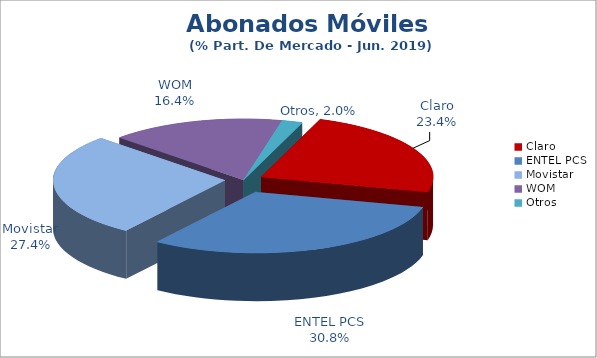
| Category | Series 0 |
|---|---|
| Claro | 0.234 |
| ENTEL PCS | 0.308 |
| Movistar | 0.274 |
| WOM | 0.164 |
| Otros | 0.02 |